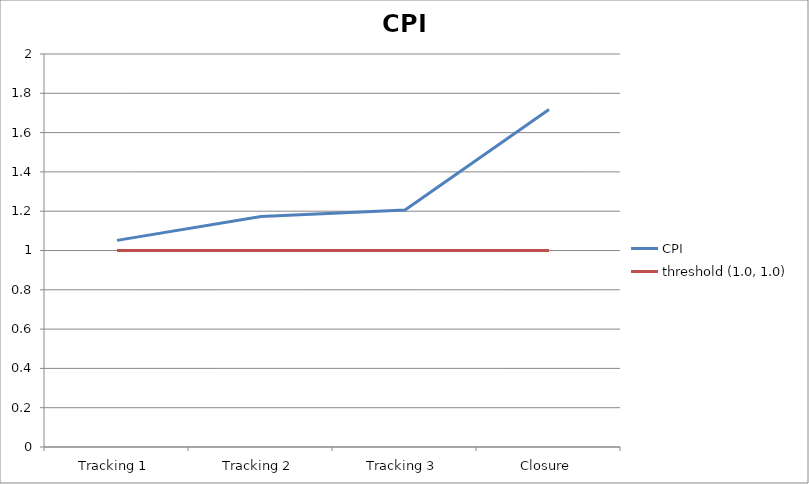
| Category | CPI | threshold (1.0, 1.0) |
|---|---|---|
| Tracking 1 | 1.051 | 1 |
| Tracking 2 | 1.173 | 1 |
| Tracking 3 | 1.207 | 1 |
| Closure | 1.717 | 1 |